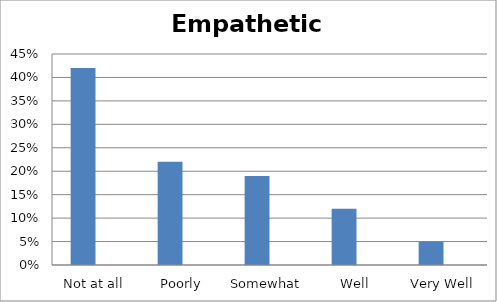
| Category | Series 0 | Series 1 |
|---|---|---|
| Not at all | 0.42 | 0 |
| Poorly | 0.22 | 0 |
| Somewhat  | 0.19 | 0 |
| Well | 0.12 | 0 |
| Very Well | 0.05 | 0 |